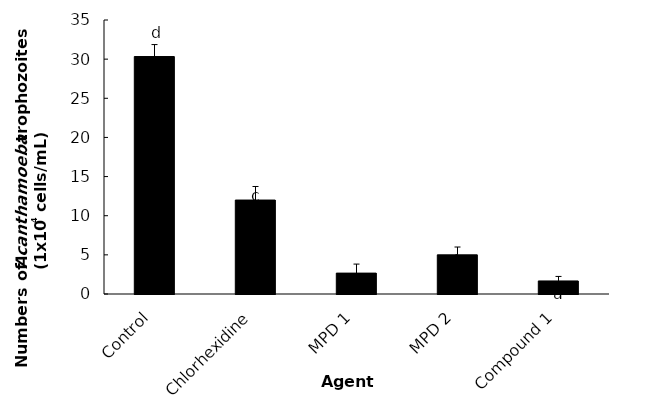
| Category | Series 0 |
|---|---|
| Control | 30.333 |
| Chlorhexidine | 12 |
| MPD 1 | 2.667 |
| MPD 2 | 5 |
| Compound 1 | 1.667 |